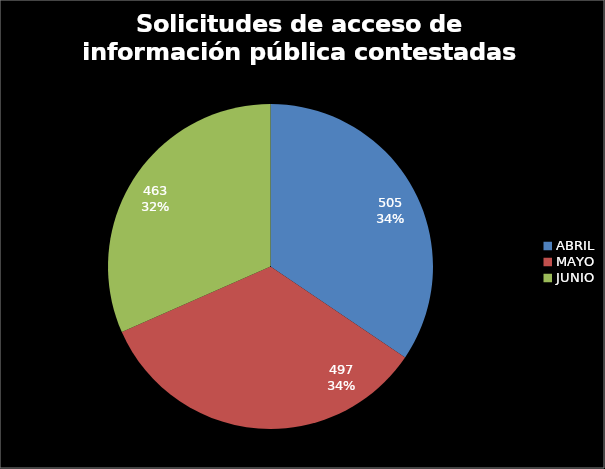
| Category | Solicitudes de acceso de información pública contestadas desde la UAC |
|---|---|
| ABRIL | 505 |
| MAYO | 497 |
| JUNIO | 463 |